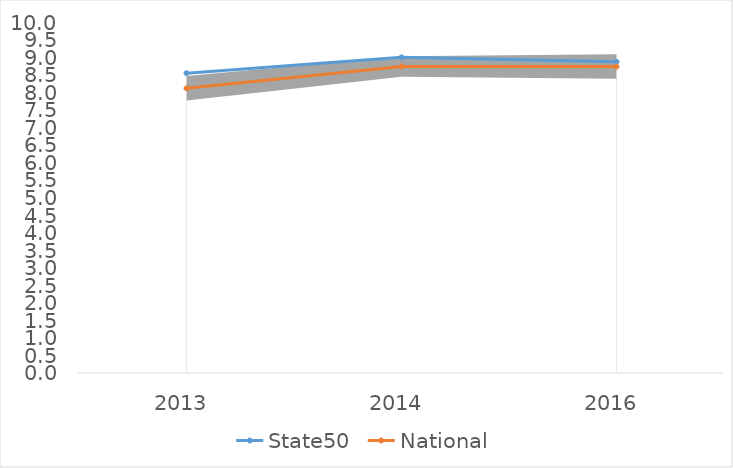
| Category | State50 | National |
|---|---|---|
| 2013.0 | 8.542 | 8.112 |
| 2014.0 | 8.993 | 8.732 |
| 2016.0 | 8.868 | 8.73 |